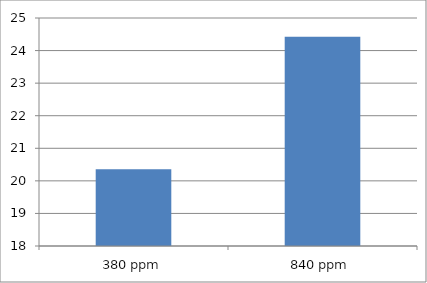
| Category | Series 0 |
|---|---|
| 380 ppm | 20.357 |
| 840 ppm | 24.424 |